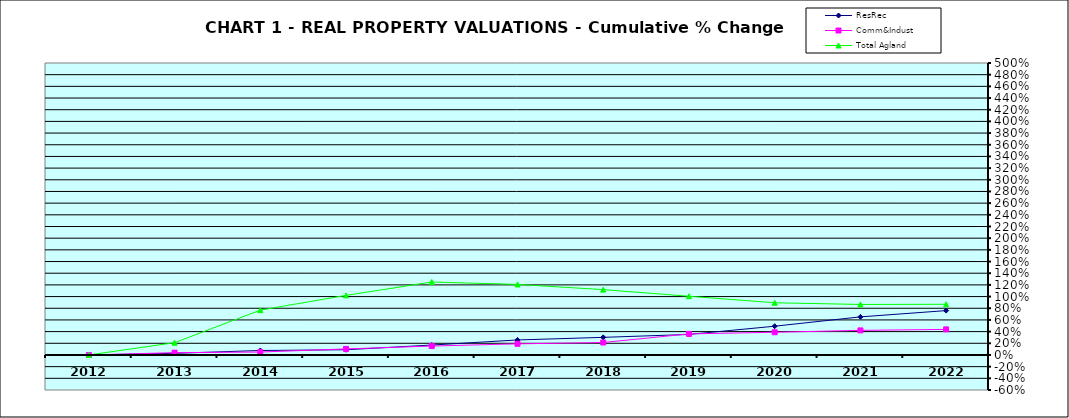
| Category | ResRec | Comm&Indust | Total Agland |
|---|---|---|---|
| 2012.0 | 0 | 0 | 0 |
| 2013.0 | 0.028 | 0.04 | 0.21 |
| 2014.0 | 0.076 | 0.05 | 0.768 |
| 2015.0 | 0.089 | 0.103 | 1.021 |
| 2016.0 | 0.17 | 0.153 | 1.249 |
| 2017.0 | 0.257 | 0.191 | 1.208 |
| 2018.0 | 0.302 | 0.213 | 1.119 |
| 2019.0 | 0.351 | 0.361 | 1.006 |
| 2020.0 | 0.492 | 0.389 | 0.894 |
| 2021.0 | 0.652 | 0.421 | 0.865 |
| 2022.0 | 0.76 | 0.438 | 0.868 |